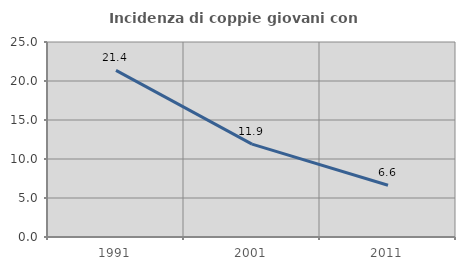
| Category | Incidenza di coppie giovani con figli |
|---|---|
| 1991.0 | 21.368 |
| 2001.0 | 11.915 |
| 2011.0 | 6.641 |